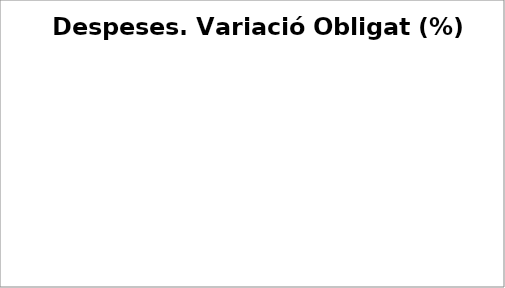
| Category | Series 0 |
|---|---|
| Despeses de personal | 0.046 |
| Despeses en béns corrents i serveis | 0.063 |
| Despeses financeres | -0.628 |
| Transferències corrents | 0.052 |
| Fons de contingència | 0 |
| Inversions reals | -0.167 |
| Transferències de capital | 2.256 |
| Actius financers | 0.062 |
| Passius financers | 0.003 |